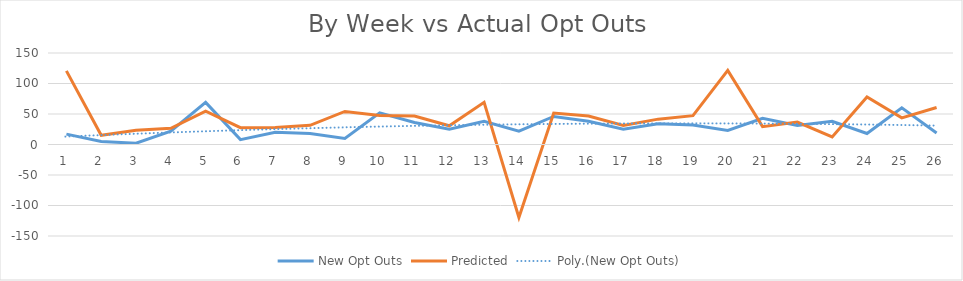
| Category | New Opt Outs | Predicted |
|---|---|---|
| 0 | 17 | 120.677 |
| 1 | 5 | 15.033 |
| 2 | 2 | 23.316 |
| 3 | 22 | 26.481 |
| 4 | 69 | 54.77 |
| 5 | 8 | 27.553 |
| 6 | 20 | 27.973 |
| 7 | 18 | 31.372 |
| 8 | 10 | 54.189 |
| 9 | 52 | 47.459 |
| 10 | 36 | 46.56 |
| 11 | 25 | 30.642 |
| 12 | 38 | 69.186 |
| 13 | 22 | -119.655 |
| 14 | 46 | 51.505 |
| 15 | 38 | 46.78 |
| 16 | 25 | 31.187 |
| 17 | 34 | 41.569 |
| 18 | 32 | 47.279 |
| 19 | 23 | 121.472 |
| 20 | 43 | 29.261 |
| 21 | 31 | 36.892 |
| 22 | 38 | 12.495 |
| 23 | 18 | 77.924 |
| 24 | 60 | 43.685 |
| 25 | 19 | 60.641 |